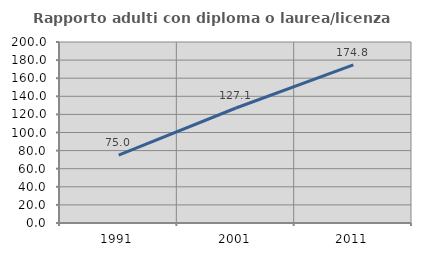
| Category | Rapporto adulti con diploma o laurea/licenza media  |
|---|---|
| 1991.0 | 74.958 |
| 2001.0 | 127.063 |
| 2011.0 | 174.77 |